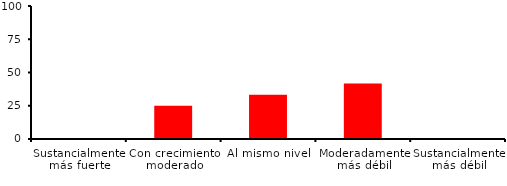
| Category | Series 0 |
|---|---|
| Sustancialmente más fuerte | 0 |
| Con crecimiento moderado | 25 |
| Al mismo nivel | 33.333 |
| Moderadamente más débil | 41.667 |
| Sustancialmente más débil | 0 |